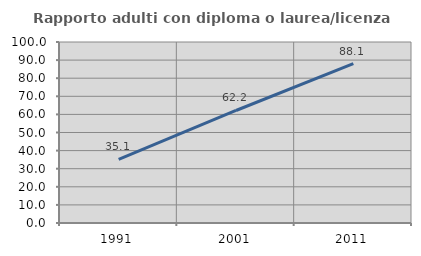
| Category | Rapporto adulti con diploma o laurea/licenza media  |
|---|---|
| 1991.0 | 35.135 |
| 2001.0 | 62.162 |
| 2011.0 | 88.095 |